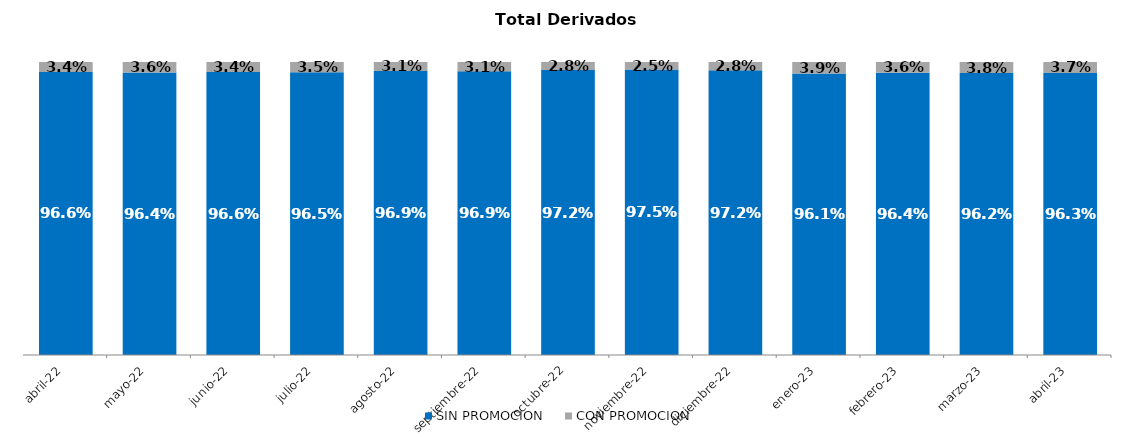
| Category | SIN PROMOCION   | CON PROMOCION   |
|---|---|---|
| 2022-04-01 | 0.966 | 0.034 |
| 2022-05-01 | 0.964 | 0.036 |
| 2022-06-01 | 0.966 | 0.034 |
| 2022-07-01 | 0.965 | 0.035 |
| 2022-08-01 | 0.969 | 0.031 |
| 2022-09-01 | 0.969 | 0.031 |
| 2022-10-01 | 0.972 | 0.028 |
| 2022-11-01 | 0.975 | 0.025 |
| 2022-12-01 | 0.972 | 0.028 |
| 2023-01-01 | 0.961 | 0.039 |
| 2023-02-01 | 0.964 | 0.036 |
| 2023-03-01 | 0.962 | 0.038 |
| 2023-04-01 | 0.963 | 0.037 |